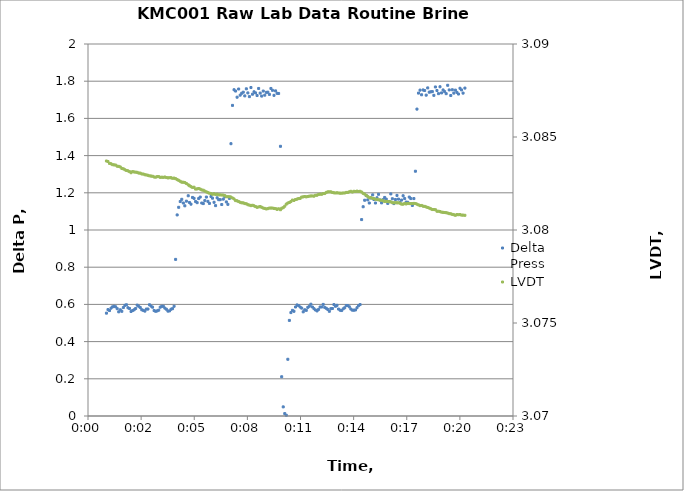
| Category | Delta Press |
|---|---|
| 0.0006944444444444445 | 0.553 |
| 0.0007523148137907912 | 0.572 |
| 0.0008101851831371379 | 0.567 |
| 0.0008680555524834846 | 0.58 |
| 0.0009259259218298313 | 0.587 |
| 0.0009837962984521357 | 0.59 |
| 0.0010416666677984824 | 0.587 |
| 0.0010995370371448291 | 0.577 |
| 0.0011574074064911758 | 0.56 |
| 0.0012152777758375225 | 0.571 |
| 0.0012731481451838693 | 0.563 |
| 0.001331018514530216 | 0.583 |
| 0.0013888888911525203 | 0.595 |
| 0.001446759260498867 | 0.598 |
| 0.0015046296298452137 | 0.582 |
| 0.0015624999991915604 | 0.578 |
| 0.001620370368537907 | 0.562 |
| 0.0016782407378842538 | 0.567 |
| 0.0017361111072306005 | 0.571 |
| 0.0017939814838529048 | 0.578 |
| 0.0018518518531992515 | 0.596 |
| 0.0019097222225455983 | 0.59 |
| 0.001967592591891945 | 0.583 |
| 0.0020254629612382917 | 0.571 |
| 0.0020833333305846384 | 0.568 |
| 0.002141203699930985 | 0.564 |
| 0.0021990740765532894 | 0.575 |
| 0.002256944445899636 | 0.575 |
| 0.002314814815245983 | 0.598 |
| 0.0023726851845923295 | 0.591 |
| 0.0024305555539386762 | 0.585 |
| 0.002488425923285023 | 0.567 |
| 0.0025462962926313696 | 0.563 |
| 0.0026041666619777163 | 0.565 |
| 0.0026620370386000207 | 0.569 |
| 0.0027199074079463674 | 0.585 |
| 0.002777777777292714 | 0.59 |
| 0.0028356481466390608 | 0.59 |
| 0.0028935185159854075 | 0.58 |
| 0.002951388885331754 | 0.574 |
| 0.003009259254678101 | 0.564 |
| 0.003067129631300405 | 0.565 |
| 0.003125000000646752 | 0.574 |
| 0.0031828703699930986 | 0.577 |
| 0.0032407407393394453 | 0.59 |
| 0.003298611108685792 | 0.842 |
| 0.0033564814780321387 | 1.081 |
| 0.0034143518473784855 | 1.122 |
| 0.0034722222240007898 | 1.153 |
| 0.0035300925933471365 | 1.165 |
| 0.003587962962693483 | 1.145 |
| 0.00364583333203983 | 1.13 |
| 0.0037037037013861766 | 1.155 |
| 0.0037731481475121757 | 1.184 |
| 0.00381944444007887 | 1.148 |
| 0.0038773148167011743 | 1.139 |
| 0.003935185186047521 | 1.175 |
| 0.003993055555393868 | 1.17 |
| 0.0040509259247402144 | 1.153 |
| 0.004108796294086561 | 1.147 |
| 0.004166666663432908 | 1.169 |
| 0.004224537032779255 | 1.177 |
| 0.004282407409401559 | 1.145 |
| 0.004340277778747906 | 1.142 |
| 0.004398148148094252 | 1.158 |
| 0.004456018517440599 | 1.177 |
| 0.004513888886786946 | 1.154 |
| 0.004571759256133292 | 1.143 |
| 0.004629629625479639 | 1.18 |
| 0.0046875000021019434 | 1.171 |
| 0.00474537037144829 | 1.149 |
| 0.004803240740794637 | 1.131 |
| 0.0048611111101409836 | 1.173 |
| 0.00491898147948733 | 1.163 |
| 0.004976851848833677 | 1.163 |
| 0.005034722218180024 | 1.137 |
| 0.005092592594802328 | 1.166 |
| 0.005150462964148675 | 1.179 |
| 0.005208333333495021 | 1.151 |
| 0.005266203702841368 | 1.138 |
| 0.005324074072187715 | 1.17 |
| 0.0053819444415340615 | 1.464 |
| 0.005439814810880408 | 1.67 |
| 0.0054976851875027126 | 1.754 |
| 0.005555555556849059 | 1.747 |
| 0.005613425926195406 | 1.714 |
| 0.005671296295541753 | 1.758 |
| 0.005729166664888099 | 1.725 |
| 0.005787037034234446 | 1.735 |
| 0.005844907403580793 | 1.741 |
| 0.005902777780203097 | 1.721 |
| 0.005960648149549444 | 1.759 |
| 0.0060185185188957905 | 1.737 |
| 0.006076388888242137 | 1.717 |
| 0.006134259257588484 | 1.766 |
| 0.006192129626934831 | 1.73 |
| 0.006249999996281177 | 1.743 |
| 0.006307870372903482 | 1.737 |
| 0.006365740742249828 | 1.723 |
| 0.006423611111596175 | 1.761 |
| 0.006481481480942522 | 1.736 |
| 0.0065393518502888685 | 1.72 |
| 0.006597222219635215 | 1.747 |
| 0.006655092588981562 | 1.725 |
| 0.006712962958327909 | 1.74 |
| 0.006770833334950213 | 1.741 |
| 0.00682870370429656 | 1.729 |
| 0.006886574073642906 | 1.761 |
| 0.006944444442989253 | 1.751 |
| 0.0070023148123356 | 1.724 |
| 0.0070601851816819465 | 1.748 |
| 0.007118055551028293 | 1.735 |
| 0.0071759259276505975 | 1.734 |
| 0.007245370366500639 | 1.45 |
| 0.007291666666343291 | 0.211 |
| 0.007349537035689638 | 0.049 |
| 0.007407407405035984 | 0.013 |
| 0.007465277774382331 | 0.004 |
| 0.007523148143728678 | 0.305 |
| 0.007581018520350982 | 0.514 |
| 0.007638888889697329 | 0.556 |
| 0.0076967592590436755 | 0.568 |
| 0.007754629628390022 | 0.563 |
| 0.007812499997736369 | 0.586 |
| 0.007870370367082716 | 0.597 |
| 0.007928240736429063 | 0.594 |
| 0.007986111113051367 | 0.586 |
| 0.008043981482397714 | 0.58 |
| 0.008101851851744061 | 0.56 |
| 0.008159722221090408 | 0.571 |
| 0.008217592590436754 | 0.568 |
| 0.008275462959783101 | 0.584 |
| 0.008333333329129448 | 0.59 |
| 0.008391203705751752 | 0.601 |
| 0.008449074075098099 | 0.586 |
| 0.008506944444444445 | 0.577 |
| 0.008564814813790792 | 0.57 |
| 0.008622685183137139 | 0.565 |
| 0.008680555552483486 | 0.573 |
| 0.008738425921829832 | 0.586 |
| 0.008796296298452137 | 0.586 |
| 0.008854166667798483 | 0.6 |
| 0.00891203703714483 | 0.584 |
| 0.008969907406491177 | 0.579 |
| 0.009027777775837523 | 0.573 |
| 0.00908564814518387 | 0.563 |
| 0.009143518514530217 | 0.577 |
| 0.009201388891152521 | 0.578 |
| 0.009259259260498868 | 0.599 |
| 0.009317129629845215 | 0.59 |
| 0.009374999999191561 | 0.595 |
| 0.009432870368537908 | 0.575 |
| 0.009490740737884255 | 0.569 |
| 0.009548611107230601 | 0.567 |
| 0.009606481483852906 | 0.576 |
| 0.009664351853199252 | 0.582 |
| 0.009722222222545599 | 0.594 |
| 0.009780092591891946 | 0.594 |
| 0.009837962961238293 | 0.587 |
| 0.00989583333058464 | 0.575 |
| 0.009953703699930986 | 0.569 |
| 0.01001157407655329 | 0.569 |
| 0.010069444445899637 | 0.57 |
| 0.010127314815245984 | 0.582 |
| 0.01018518518459233 | 0.593 |
| 0.010243055553938677 | 0.599 |
| 0.010300925923285024 | 1.056 |
| 0.01035879629263137 | 1.125 |
| 0.010416666661977717 | 1.16 |
| 0.010474537038600022 | 1.185 |
| 0.010532407407946368 | 1.162 |
| 0.010590277777292715 | 1.145 |
| 0.010648148146639062 | 1.172 |
| 0.01071759259276506 | 1.189 |
| 0.010763888885331755 | 1.164 |
| 0.010821759254678102 | 1.145 |
| 0.010879629631300406 | 1.173 |
| 0.010937500000646753 | 1.192 |
| 0.0109953703699931 | 1.161 |
| 0.011053240739339446 | 1.146 |
| 0.011111111108685793 | 1.163 |
| 0.01116898147803214 | 1.175 |
| 0.011226851847378486 | 1.166 |
| 0.01128472222400079 | 1.143 |
| 0.011342592593347137 | 1.153 |
| 0.011400462962693484 | 1.194 |
| 0.01145833333203983 | 1.168 |
| 0.011516203701386177 | 1.142 |
| 0.011574074070732524 | 1.164 |
| 0.011631944440078871 | 1.186 |
| 0.011689814816701175 | 1.166 |
| 0.011747685186047522 | 1.148 |
| 0.011805555555393869 | 1.161 |
| 0.011863425924740215 | 1.184 |
| 0.011921296294086562 | 1.169 |
| 0.011979166663432909 | 1.15 |
| 0.012037037032779255 | 1.149 |
| 0.01209490740940156 | 1.177 |
| 0.012152777778747906 | 1.169 |
| 0.012210648148094253 | 1.132 |
| 0.0122685185174406 | 1.169 |
| 0.012326388886786947 | 1.316 |
| 0.012384259256133293 | 1.65 |
| 0.01244212962547964 | 1.736 |
| 0.012500000002101944 | 1.752 |
| 0.012557870371448291 | 1.727 |
| 0.012615740740794638 | 1.753 |
| 0.012673611110140984 | 1.75 |
| 0.012731481479487331 | 1.725 |
| 0.012789351848833678 | 1.764 |
| 0.012847222218180025 | 1.741 |
| 0.012905092594802329 | 1.743 |
| 0.012962962964148676 | 1.744 |
| 0.013020833333495022 | 1.724 |
| 0.013078703702841369 | 1.769 |
| 0.013136574072187716 | 1.75 |
| 0.013194444441534062 | 1.733 |
| 0.013252314810880409 | 1.77 |
| 0.013310185187502713 | 1.737 |
| 0.01336805555684906 | 1.753 |
| 0.013425925926195407 | 1.744 |
| 0.013483796295541754 | 1.733 |
| 0.0135416666648881 | 1.778 |
| 0.013599537034234447 | 1.753 |
| 0.013657407403580794 | 1.723 |
| 0.013715277780203098 | 1.754 |
| 0.013773148149549445 | 1.736 |
| 0.013831018518895791 | 1.752 |
| 0.013888888888242138 | 1.74 |
| 0.013946759257588485 | 1.731 |
| 0.014004629626934832 | 1.762 |
| 0.014062499996281178 | 1.753 |
| 0.014120370372903483 | 1.736 |
| 0.014189814811753524 | 1.763 |